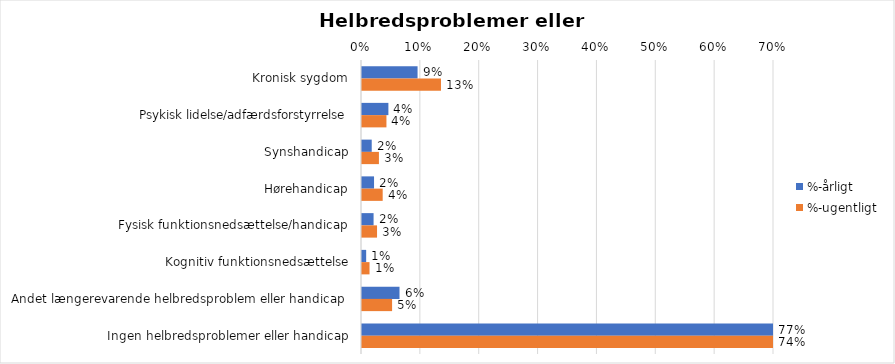
| Category | %-årligt | %-ugentligt |
|---|---|---|
| Kronisk sygdom | 0.094 | 0.134 |
| Psykisk lidelse/adfærdsforstyrrelse | 0.045 | 0.042 |
| Synshandicap | 0.017 | 0.029 |
| Hørehandicap | 0.02 | 0.035 |
| Fysisk funktionsnedsættelse/handicap | 0.02 | 0.026 |
| Kognitiv funktionsnedsættelse | 0.007 | 0.013 |
| Andet længerevarende helbredsproblem eller handicap  | 0.064 | 0.051 |
| Ingen helbredsproblemer eller handicap | 0.775 | 0.738 |